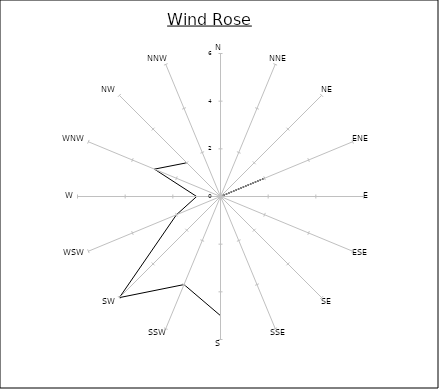
| Category | Series 0 |
|---|---|
| N | 3 |
| NNE | 0 |
| NE | 0 |
| ENE | 2 |
| E | 0 |
| ESE | 0 |
| SE | 1 |
| SSE | 0 |
| S | 5 |
| SSW | 4 |
| SW | 6 |
| WSW | 2 |
| W | 1 |
| WNW | 3 |
| NW | 2 |
| NNW | 0 |